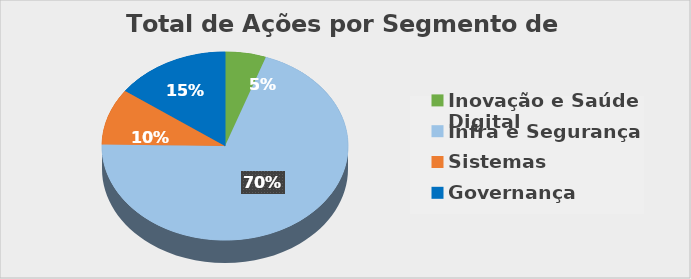
| Category | Series 0 |
|---|---|
| Inovação e Saúde Digital | 5 |
| Infra e Segurança | 65 |
| Sistemas | 9 |
| Governança | 14 |